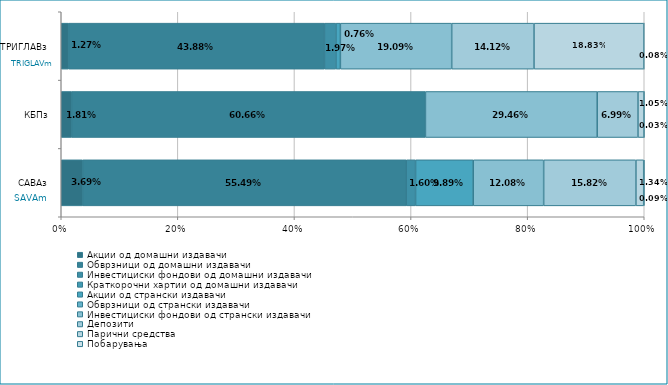
| Category | Акции од домашни издавачи  | Обврзници од домашни издавачи  | Инвестициски фондови од домашни издавачи  | Краткорочни хартии од домашни издавачи  | Акции од странски издавачи  | Обврзници од странски издавачи  | Инвестициски фондови од странски издавaчи | Депозити  | Парични средства  | Побарувања |
|---|---|---|---|---|---|---|---|---|---|---|
| САВАз | 0.037 | 0.555 | 0.016 | 0 | 0.099 | 0 | 0.121 | 0.158 | 0.013 | 0.001 |
| КБПз | 0.018 | 0.607 | 0 | 0 | 0 | 0 | 0.295 | 0.07 | 0.01 | 0 |
| ТРИГЛАВз | 0.013 | 0.439 | 0.02 | 0 | 0.008 | 0 | 0.191 | 0.141 | 0.188 | 0.001 |